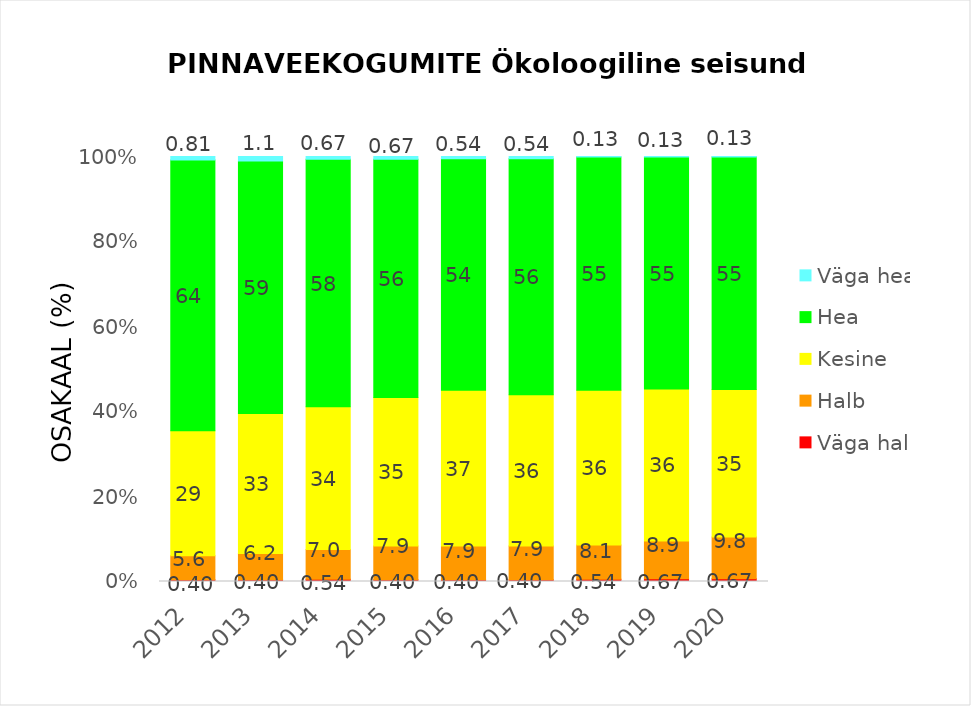
| Category | Väga halb | Halb | Kesine | Hea | Väga hea |
|---|---|---|---|---|---|
| 2012.0 | 0.403 | 5.645 | 29.435 | 63.71 | 0.806 |
| 2013.0 | 0.403 | 6.183 | 32.93 | 59.409 | 1.075 |
| 2014.0 | 0.538 | 6.989 | 33.602 | 58.199 | 0.672 |
| 2015.0 | 0.403 | 7.93 | 34.946 | 56.048 | 0.672 |
| 2016.0 | 0.403 | 7.93 | 36.694 | 54.435 | 0.538 |
| 2017.0 | 0.403 | 7.93 | 35.618 | 55.511 | 0.538 |
| 2018.0 | 0.538 | 8.065 | 36.425 | 54.839 | 0.134 |
| 2019.0 | 0.672 | 8.871 | 35.753 | 54.57 | 0.134 |
| 2020.0 | 0.672 | 9.812 | 34.677 | 54.704 | 0.134 |